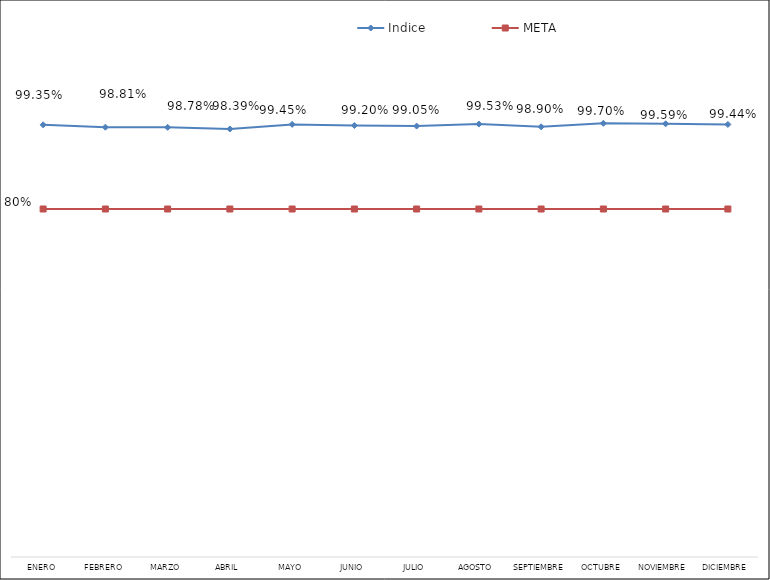
| Category | Indice | META |
|---|---|---|
| Enero | 0.993 | 0.8 |
| Febrero | 0.988 | 0.8 |
| Marzo | 0.988 | 0.8 |
| Abril | 0.984 | 0.8 |
| Mayo | 0.995 | 0.8 |
| Junio | 0.992 | 0.8 |
| Julio | 0.991 | 0.8 |
| Agosto | 0.995 | 0.8 |
| Septiembre | 0.989 | 0.8 |
| Octubre | 0.997 | 0.8 |
| Noviembre | 0.996 | 0.8 |
| Diciembre | 0.994 | 0.8 |